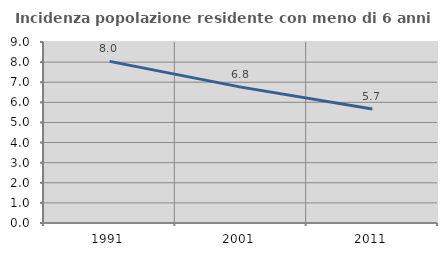
| Category | Incidenza popolazione residente con meno di 6 anni |
|---|---|
| 1991.0 | 8.038 |
| 2001.0 | 6.756 |
| 2011.0 | 5.666 |